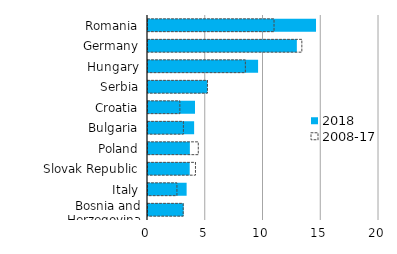
| Category | 2018 | 2008-17 |
|---|---|---|
| Romania | 14.547 | 10.911 |
| Germany | 12.887 | 13.319 |
| Hungary | 9.531 | 8.429 |
| Serbia | 5.146 | 5.148 |
| Croatia | 4.069 | 2.759 |
| Bulgaria | 3.994 | 3.064 |
| Poland | 3.623 | 4.353 |
| Slovak Republic | 3.609 | 4.109 |
| Italy | 3.344 | 2.505 |
| Bosnia and Herzegovina | 3.082 | 3.047 |